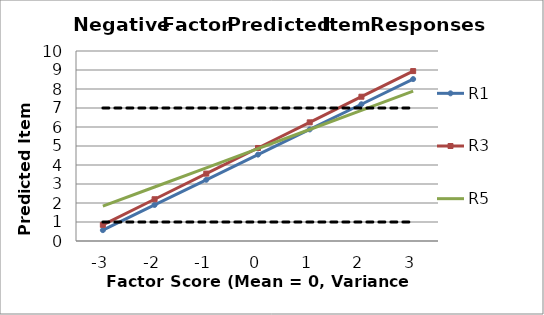
| Category | R1 | R3 | R5 | Lowest | Highest |
|---|---|---|---|---|---|
| -3.0 | 0.572 | 0.849 | 1.833 | 1 | 7 |
| -2.0 | 1.897 | 2.198 | 2.842 | 1 | 7 |
| -1.0 | 3.222 | 3.547 | 3.851 | 1 | 7 |
| 0.0 | 4.547 | 4.896 | 4.86 | 1 | 7 |
| 1.0 | 5.872 | 6.245 | 5.869 | 1 | 7 |
| 2.0 | 7.197 | 7.594 | 6.878 | 1 | 7 |
| 3.0 | 8.522 | 8.943 | 7.887 | 1 | 7 |